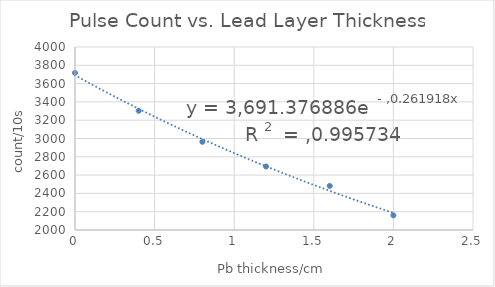
| Category | Count/(1/10s) |
|---|---|
| 0.0 | 3717 |
| 0.4 | 3303 |
| 0.8 | 2964 |
| 1.2 | 2694 |
| 1.6 | 2482 |
| 2.0 | 2160 |